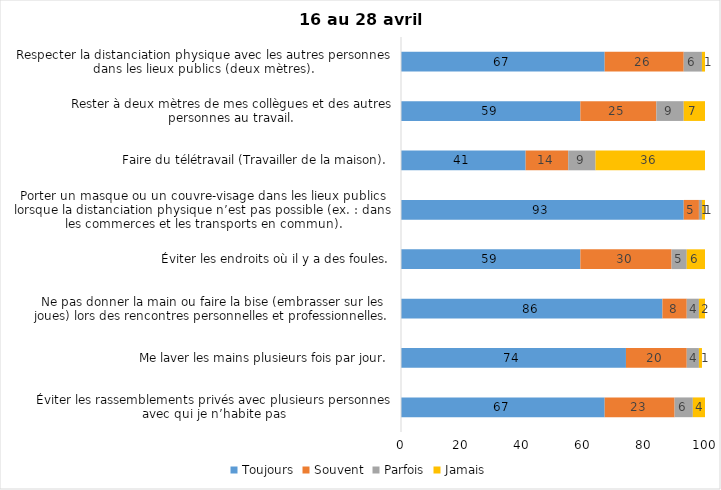
| Category | Toujours | Souvent | Parfois | Jamais |
|---|---|---|---|---|
| Éviter les rassemblements privés avec plusieurs personnes avec qui je n’habite pas | 67 | 23 | 6 | 4 |
| Me laver les mains plusieurs fois par jour. | 74 | 20 | 4 | 1 |
| Ne pas donner la main ou faire la bise (embrasser sur les joues) lors des rencontres personnelles et professionnelles. | 86 | 8 | 4 | 2 |
| Éviter les endroits où il y a des foules. | 59 | 30 | 5 | 6 |
| Porter un masque ou un couvre-visage dans les lieux publics lorsque la distanciation physique n’est pas possible (ex. : dans les commerces et les transports en commun). | 93 | 5 | 1 | 1 |
| Faire du télétravail (Travailler de la maison). | 41 | 14 | 9 | 36 |
| Rester à deux mètres de mes collègues et des autres personnes au travail. | 59 | 25 | 9 | 7 |
| Respecter la distanciation physique avec les autres personnes dans les lieux publics (deux mètres). | 67 | 26 | 6 | 1 |